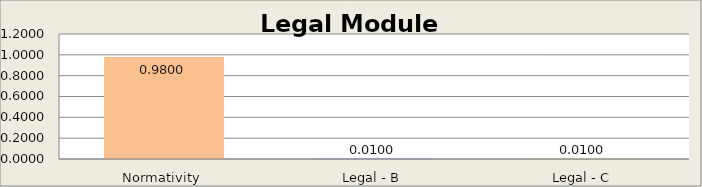
| Category | Legal Module |
|---|---|
| Normativity | 0.98 |
| Legal - B | 0.01 |
| Legal - C | 0.01 |